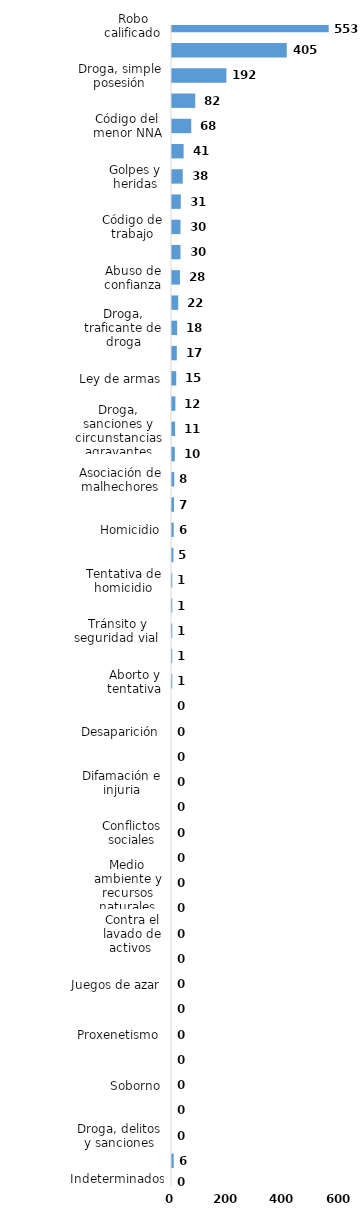
| Category | Series 0 |
|---|---|
| Robo calificado | 553 |
| Violencia intrafamiliar | 405 |
| Droga, simple posesión | 192 |
| Amenaza | 82 |
| Código del menor NNA | 68 |
| Crímenes y delitos de alta tecnología | 41 |
| Golpes y heridas | 38 |
| Violencia de género | 31 |
| Código de trabajo | 30 |
| Agresión sexual | 30 |
| Abuso de confianza | 28 |
| Estafa | 22 |
| Droga, traficante de droga | 18 |
| Droga, distribución de droga | 17 |
| Ley de armas | 15 |
| Protección animal y tenencia responsable | 12 |
| Droga, sanciones y circunstancias agravantes | 11 |
| Daños y perjuicios a la cosa ajena | 10 |
| Asociación de malhechores | 8 |
| Crímenes y delitos contra la propiedad | 7 |
| Homicidio | 6 |
| Falsificación | 5 |
| Tentativa de homicidio | 1 |
| Violación sexual | 1 |
| Tránsito y seguridad vial  | 1 |
| Ley de cheques | 1 |
| Aborto y tentativa | 1 |
| Pérdida de documento de identidad | 0 |
| Desaparición | 0 |
| Robo simple | 0 |
| Difamación e injuria | 0 |
| Propiedad industrial, intelectual y derecho de autor | 0 |
| Conflictos sociales | 0 |
| Tráfico ilícito de migrantes y trata de personas | 0 |
| Medio ambiente y recursos naturales | 0 |
| Secuestro | 0 |
| Contra el lavado de activos  | 0 |
| Ley general de salud | 0 |
| Juegos de azar | 0 |
| Derechos humanos | 0 |
| Proxenetismo | 0 |
| Terrorismo | 0 |
| Soborno | 0 |
| Prevaricación | 0 |
| Droga, delitos y sanciones | 0 |
| Otros | 6 |
| Indeterminados | 0 |